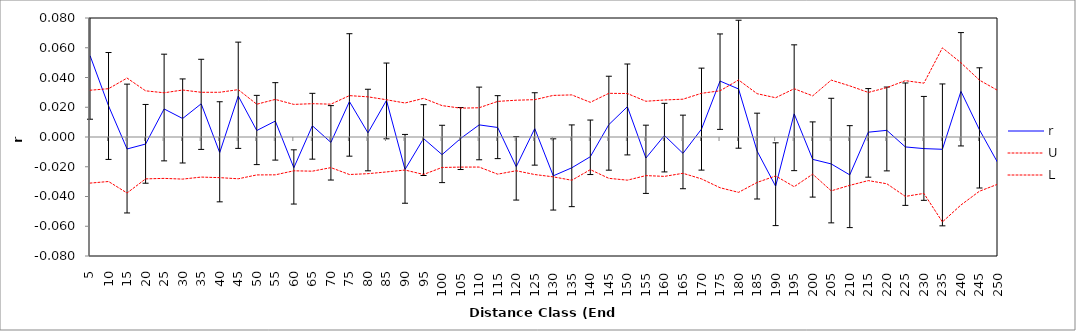
| Category | r | U | L |
|---|---|---|---|
| 5.0 | 0.055 | 0.031 | -0.031 |
| 10.0 | 0.021 | 0.032 | -0.03 |
| 15.0 | -0.008 | 0.04 | -0.038 |
| 20.0 | -0.005 | 0.031 | -0.028 |
| 25.0 | 0.019 | 0.03 | -0.028 |
| 30.0 | 0.012 | 0.032 | -0.028 |
| 35.0 | 0.022 | 0.03 | -0.027 |
| 40.0 | -0.011 | 0.03 | -0.027 |
| 45.0 | 0.028 | 0.032 | -0.028 |
| 50.0 | 0.004 | 0.022 | -0.026 |
| 55.0 | 0.011 | 0.025 | -0.025 |
| 60.0 | -0.021 | 0.022 | -0.023 |
| 65.0 | 0.008 | 0.022 | -0.023 |
| 70.0 | -0.004 | 0.022 | -0.021 |
| 75.0 | 0.024 | 0.028 | -0.025 |
| 80.0 | 0.003 | 0.027 | -0.025 |
| 85.0 | 0.025 | 0.025 | -0.023 |
| 90.0 | -0.022 | 0.023 | -0.022 |
| 95.0 | -0.001 | 0.026 | -0.025 |
| 100.0 | -0.012 | 0.021 | -0.02 |
| 105.0 | -0.001 | 0.019 | -0.02 |
| 110.0 | 0.008 | 0.02 | -0.02 |
| 115.0 | 0.006 | 0.024 | -0.025 |
| 120.0 | -0.02 | 0.025 | -0.023 |
| 125.0 | 0.006 | 0.025 | -0.025 |
| 130.0 | -0.026 | 0.028 | -0.027 |
| 135.0 | -0.021 | 0.028 | -0.029 |
| 140.0 | -0.013 | 0.023 | -0.022 |
| 145.0 | 0.008 | 0.029 | -0.028 |
| 150.0 | 0.02 | 0.029 | -0.029 |
| 155.0 | -0.014 | 0.024 | -0.026 |
| 160.0 | 0.001 | 0.025 | -0.026 |
| 165.0 | -0.011 | 0.025 | -0.024 |
| 170.0 | 0.005 | 0.029 | -0.028 |
| 175.0 | 0.038 | 0.031 | -0.034 |
| 180.0 | 0.032 | 0.038 | -0.037 |
| 185.0 | -0.009 | 0.029 | -0.031 |
| 190.0 | -0.033 | 0.026 | -0.026 |
| 195.0 | 0.016 | 0.032 | -0.033 |
| 200.0 | -0.015 | 0.028 | -0.025 |
| 205.0 | -0.018 | 0.038 | -0.036 |
| 210.0 | -0.025 | 0.034 | -0.033 |
| 215.0 | 0.003 | 0.03 | -0.029 |
| 220.0 | 0.004 | 0.033 | -0.031 |
| 225.0 | -0.007 | 0.038 | -0.04 |
| 230.0 | -0.008 | 0.036 | -0.038 |
| 235.0 | -0.008 | 0.06 | -0.057 |
| 240.0 | 0.031 | 0.05 | -0.046 |
| 245.0 | 0.005 | 0.038 | -0.036 |
| 250.0 | -0.018 | 0.031 | -0.032 |